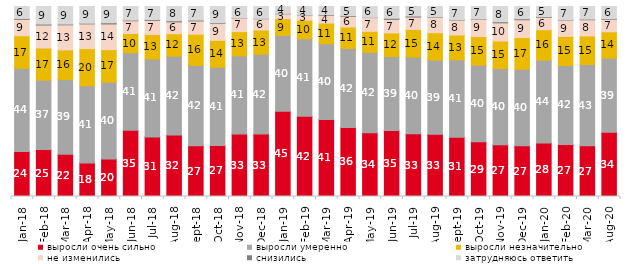
| Category | выросли очень сильно | выросли умеренно | выросли незначительно | не изменились | снизились | затрудняюсь ответить |
|---|---|---|---|---|---|---|
| 2018-01-01 | 23.75 | 43.7 | 17.15 | 8.65 | 0.45 | 6.3 |
| 2018-02-01 | 24.7 | 36.55 | 16.9 | 12.1 | 0.5 | 9.25 |
| 2018-03-01 | 22.25 | 39.3 | 15.6 | 13.2 | 0.4 | 9.25 |
| 2018-04-01 | 17.65 | 40.65 | 19.55 | 13 | 0.35 | 8.8 |
| 2018-05-01 | 19.75 | 40.4 | 17.15 | 13.5 | 0.65 | 8.55 |
| 2018-06-01 | 34.85 | 40.8 | 10.15 | 6.7 | 0.35 | 7.15 |
| 2018-07-01 | 31.3 | 41.05 | 12.9 | 7.4 | 0.45 | 6.85 |
| 2018-08-01 | 32.35 | 41.5 | 11.8 | 6.25 | 0.6 | 7.5 |
| 2018-09-01 | 26.7 | 42.3 | 16.4 | 7 | 0.45 | 7.15 |
| 2018-10-01 | 26.9 | 41.15 | 14.15 | 8.9 | 0.35 | 8.55 |
| 2018-11-01 | 32.934 | 41.068 | 12.774 | 7.036 | 0.1 | 6.088 |
| 2018-12-01 | 32.85 | 42 | 12.75 | 5.95 | 0.2 | 6.25 |
| 2019-01-01 | 44.85 | 39.95 | 8.75 | 2.6 | 0.2 | 3.65 |
| 2019-02-01 | 42.2 | 40.85 | 9.75 | 2.7 | 0.1 | 4.4 |
| 2019-03-01 | 40.527 | 39.881 | 10.84 | 4.177 | 0.348 | 4.227 |
| 2019-04-01 | 36.337 | 41.535 | 11.337 | 5.594 | 0.396 | 4.802 |
| 2019-05-01 | 33.531 | 42.298 | 11.095 | 7.231 | 0.149 | 5.696 |
| 2019-06-01 | 34.763 | 38.853 | 12.469 | 7.132 | 0.599 | 6.185 |
| 2019-07-01 | 32.97 | 40.446 | 14.505 | 6.535 | 0.545 | 5 |
| 2019-08-01 | 32.767 | 39.011 | 14.436 | 8.192 | 0.25 | 5.345 |
| 2019-09-01 | 31.188 | 40.743 | 13.069 | 7.871 | 0.248 | 6.881 |
| 2019-10-01 | 28.762 | 40.347 | 15.099 | 8.96 | 0.248 | 6.584 |
| 2019-11-01 | 27.178 | 40.149 | 14.505 | 9.554 | 0.594 | 8.02 |
| 2019-12-01 | 26.683 | 40.297 | 16.683 | 9.356 | 0.545 | 6.436 |
| 2020-01-01 | 28.218 | 43.515 | 16.04 | 6.436 | 0.396 | 5.396 |
| 2020-02-01 | 27.426 | 41.535 | 15.297 | 8.614 | 0.198 | 6.931 |
| 2020-03-01 | 26.673 | 42.786 | 15.072 | 8.478 | 0.347 | 6.644 |
| 2020-08-01 | 33.813 | 38.977 | 13.903 | 6.554 | 0.348 | 6.405 |